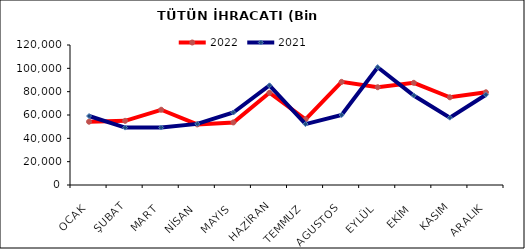
| Category | 2022 | 2021 |
|---|---|---|
| OCAK | 54248.672 | 59118.004 |
| ŞUBAT | 55002.359 | 49195.792 |
| MART | 64496.354 | 49264.961 |
| NİSAN | 51947.964 | 52377.637 |
| MAYIS | 53632.734 | 62131.953 |
| HAZİRAN | 79070.991 | 85386.681 |
| TEMMUZ | 56311.74 | 52207.469 |
| AGUSTOS | 88413.106 | 60022.116 |
| EYLÜL | 83802.197 | 100938.862 |
| EKİM | 87581.334 | 76717.204 |
| KASIM | 75182.486 | 57727.289 |
| ARALIK | 79483.836 | 77389.95 |